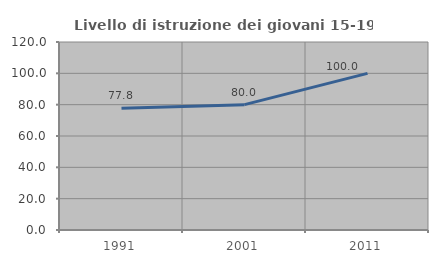
| Category | Livello di istruzione dei giovani 15-19 anni |
|---|---|
| 1991.0 | 77.778 |
| 2001.0 | 80 |
| 2011.0 | 100 |